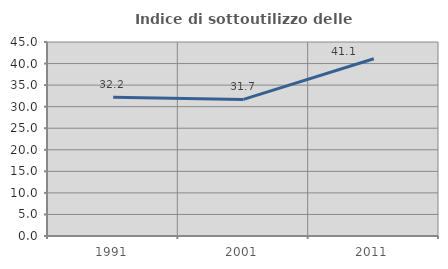
| Category | Indice di sottoutilizzo delle abitazioni  |
|---|---|
| 1991.0 | 32.192 |
| 2001.0 | 31.677 |
| 2011.0 | 41.111 |